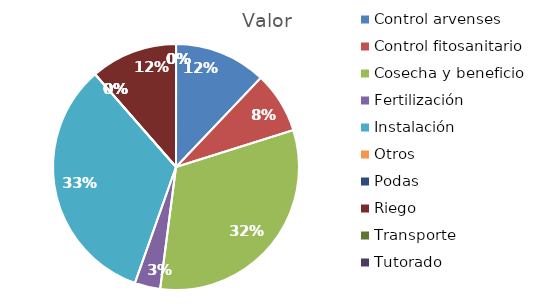
| Category | Valor |
|---|---|
| Control arvenses | 1068588 |
| Control fitosanitario | 712392 |
| Cosecha y beneficio | 2819889 |
| Fertilización | 296830 |
| Instalación | 2931261 |
| Otros | 0 |
| Podas | 0 |
| Riego | 1009222 |
| Transporte | 0 |
| Tutorado | 0 |